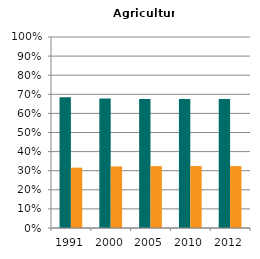
| Category | Male | Female |
|---|---|---|
| 1991.0 | 0.684 | 0.316 |
| 2000.0 | 0.678 | 0.322 |
| 2005.0 | 0.676 | 0.324 |
| 2010.0 | 0.675 | 0.325 |
| 2012.0 | 0.676 | 0.324 |